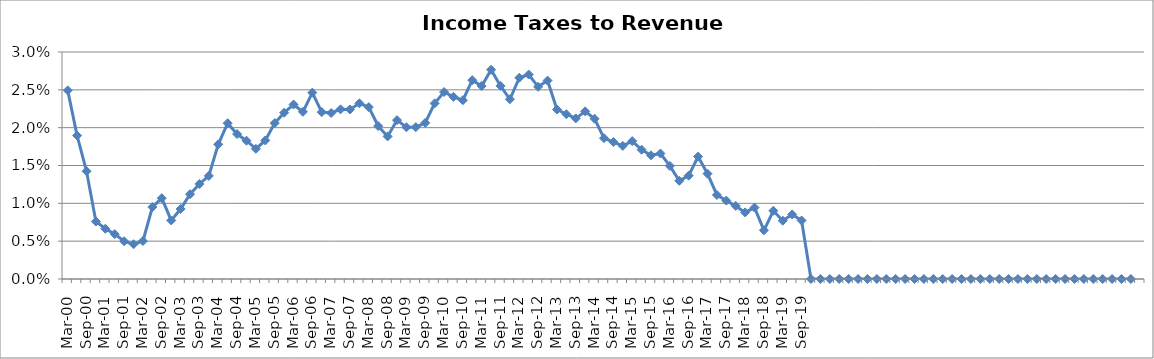
| Category | Income Taxes to Revenue (%) |
|---|---|
| Mar-00 | 0.025 |
| Jun-00 | 0.019 |
| Sep-00 | 0.014 |
| Dec-00 | 0.008 |
| Mar-01 | 0.007 |
| Jun-01 | 0.006 |
| Sep-01 | 0.005 |
| Dec-01 | 0.005 |
| Mar-02 | 0.005 |
| Jun-02 | 0.01 |
| Sep-02 | 0.011 |
| Dec-02 | 0.008 |
| Mar-03 | 0.009 |
| Jun-03 | 0.011 |
| Sep-03 | 0.013 |
| Dec-03 | 0.014 |
| Mar-04 | 0.018 |
| Jun-04 | 0.021 |
| Sep-04 | 0.019 |
| Dec-04 | 0.018 |
| Mar-05 | 0.017 |
| Jun-05 | 0.018 |
| Sep-05 | 0.021 |
| Dec-05 | 0.022 |
| Mar-06 | 0.023 |
| Jun-06 | 0.022 |
| Sep-06 | 0.025 |
| Dec-06 | 0.022 |
| Mar-07 | 0.022 |
| Jun-07 | 0.022 |
| Sep-07 | 0.022 |
| Dec-07 | 0.023 |
| Mar-08 | 0.023 |
| Jun-08 | 0.02 |
| Sep-08 | 0.019 |
| Dec-08 | 0.021 |
| Mar-09 | 0.02 |
| Jun-09 | 0.02 |
| Sep-09 | 0.021 |
| Dec-09 | 0.023 |
| Mar-10 | 0.025 |
| Jun-10 | 0.024 |
| Sep-10 | 0.024 |
| Dec-10 | 0.026 |
| Mar-11 | 0.026 |
| Jun-11 | 0.028 |
| Sep-11 | 0.026 |
| Dec-11 | 0.024 |
| Mar-12 | 0.027 |
| Jun-12 | 0.027 |
| Sep-12 | 0.025 |
| Dec-12 | 0.026 |
| Mar-13 | 0.022 |
| Jun-13 | 0.022 |
| Sep-13 | 0.021 |
| Dec-13 | 0.022 |
| Mar-14 | 0.021 |
| Jun-14 | 0.019 |
| Sep-14 | 0.018 |
| Dec-14 | 0.018 |
| Mar-15 | 0.018 |
| Jun-15 | 0.017 |
| Sep-15 | 0.016 |
| Dec-15 | 0.017 |
| Mar-16 | 0.015 |
| Jun-16 | 0.013 |
| Sep-16 | 0.014 |
| Dec-16 | 0.016 |
| Mar-17 | 0.014 |
| Jun-17 | 0.011 |
| Sep-17 | 0.01 |
| Dec-17 | 0.01 |
| Mar-18 | 0.009 |
| Jun-18 | 0.009 |
| Sep-18 | 0.006 |
| Dec-18 | 0.009 |
| Mar-19 | 0.008 |
| Jun-19 | 0.009 |
| Sep-19 | 0.008 |